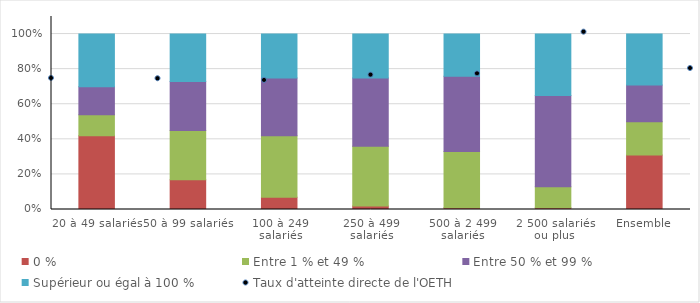
| Category | 0 % | Entre 1 % et 49 % | Entre 50 % et 99 % | Supérieur ou égal à 100 % |
|---|---|---|---|---|
| 20 à 49 salariés | 42 | 12 | 16 | 30 |
| 50 à 99 salariés | 17 | 28 | 28 | 27 |
| 100 à 249 salariés | 7 | 35 | 33 | 25 |
| 250 à 499 salariés | 2 | 34 | 39 | 25 |
| 500 à 2 499 salariés | 1 | 32 | 43 | 24 |
| 2 500 salariés ou plus | 1 | 12 | 52 | 35 |
| Ensemble | 31 | 19 | 21 | 29 |